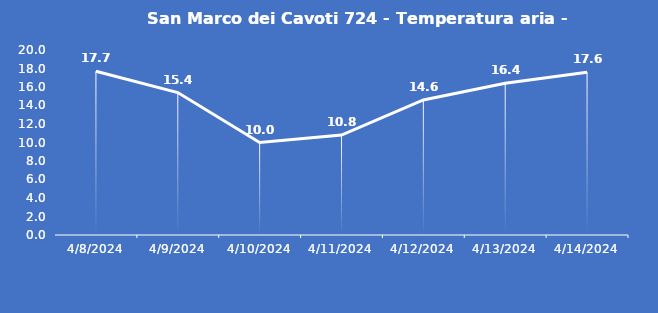
| Category | San Marco dei Cavoti 724 - Temperatura aria - Grezzo (°C) |
|---|---|
| 4/8/24 | 17.7 |
| 4/9/24 | 15.4 |
| 4/10/24 | 10 |
| 4/11/24 | 10.8 |
| 4/12/24 | 14.6 |
| 4/13/24 | 16.4 |
| 4/14/24 | 17.6 |